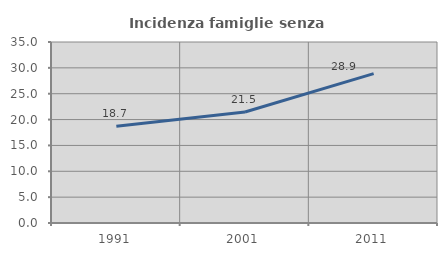
| Category | Incidenza famiglie senza nuclei |
|---|---|
| 1991.0 | 18.687 |
| 2001.0 | 21.471 |
| 2011.0 | 28.878 |